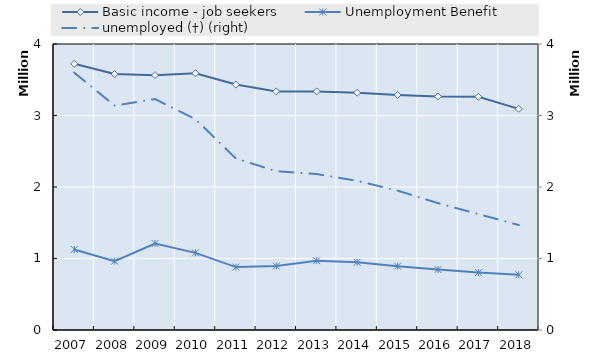
| Category | 0 | Series 14 | Series 15 | Series 16 | Series 17 | Series 18 | Series 19 | Basic income - job seekers | Unemployment Benefit |
|---|---|---|---|---|---|---|---|---|---|
| 2007.0 |  |  |  |  |  |  |  | 3722879 | 1126313 |
| 2008.0 |  |  |  |  |  |  |  | 3579228 | 962689 |
| 2009.0 |  |  |  |  |  |  |  | 3564655 | 1209081 |
| 2010.0 |  |  |  |  |  |  |  | 3590637 | 1078335 |
| 2011.0 |  |  |  |  |  |  |  | 3432347 | 880069 |
| 2012.0 |  |  |  |  |  |  |  | 3337213 | 894155 |
| 2013.0 |  |  |  |  |  |  |  | 3337194 | 969666 |
| 2014.0 |  |  |  |  |  |  |  | 3317377 | 946505 |
| 2015.0 |  |  |  |  |  |  |  | 3288220 | 892816 |
| 2016.0 |  |  |  |  |  |  |  | 3267466 | 845377 |
| 2017.0 |  |  |  |  |  |  |  | 3262236 | 803960 |
| 2018.0 |  |  |  |  |  |  |  | 3092540 | 772439 |